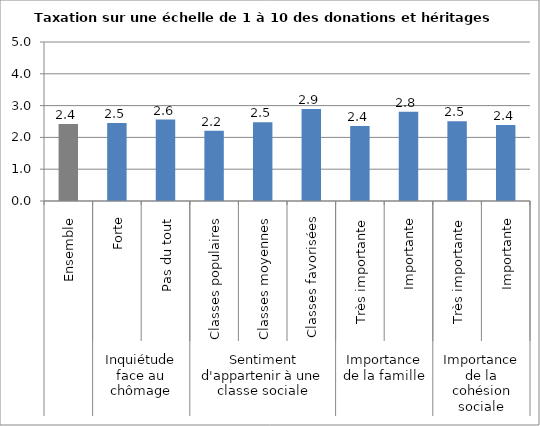
| Category | Les donations ou héritage |
|---|---|
| 0 | 2.42 |
| 1 | 2.45 |
| 2 | 2.56 |
| 3 | 2.21 |
| 4 | 2.48 |
| 5 | 2.89 |
| 6 | 2.36 |
| 7 | 2.81 |
| 8 | 2.51 |
| 9 | 2.39 |